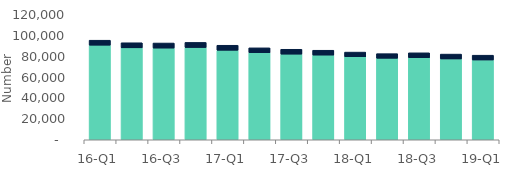
| Category | Homeowners | Buy-to-let |
|---|---|---|
| 16-Q1 | 90790 | 4800 |
| 16-Q2 | 88270 | 4870 |
| 16-Q3 | 88010 | 4880 |
| 16-Q4 | 88550 | 4930 |
| 17-Q1 | 85930 | 4810 |
| 17-Q2 | 83560 | 4700 |
| 17-Q3 | 82200 | 4690 |
| 17-Q4 | 81290 | 4670 |
| 18-Q1 | 79670 | 4500 |
| 18-Q2 | 78240 | 4440 |
| 18-Q3 | 78780 | 4710 |
| 18-Q4 | 77570 | 4690 |
| 19-Q1 | 76580 | 4620 |